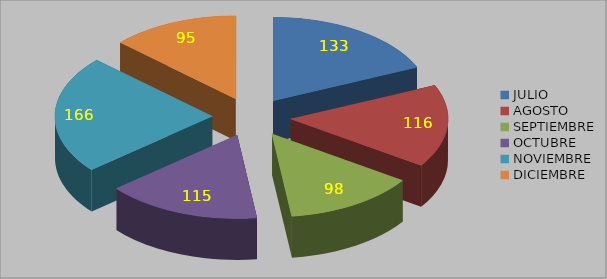
| Category | Series 0 |
|---|---|
| JULIO | 133 |
| AGOSTO | 116 |
| SEPTIEMBRE | 98 |
| OCTUBRE | 115 |
| NOVIEMBRE | 166 |
| DICIEMBRE | 95 |